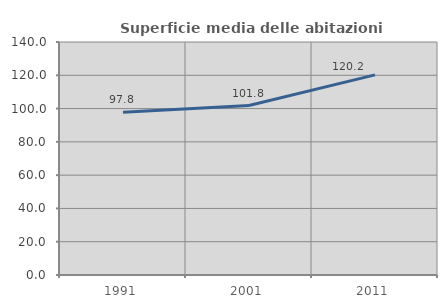
| Category | Superficie media delle abitazioni occupate |
|---|---|
| 1991.0 | 97.806 |
| 2001.0 | 101.8 |
| 2011.0 | 120.224 |